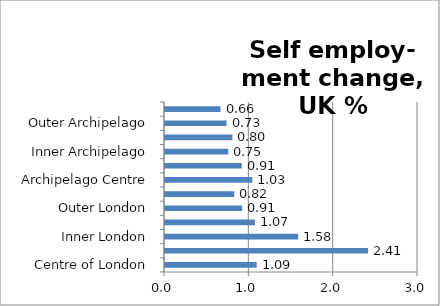
| Category | Series 0 |
|---|---|
| Centre of London | 1.087 |
| London Core | 2.408 |
| Inner London | 1.58 |
| London Suburbs | 1.067 |
| Outer London | 0.915 |
| London Edge | 0.821 |
| Archipelago Centre | 1.034 |
| Archipelago Core | 0.91 |
| Inner Archipelago | 0.75 |
| Archipelago Suburbs | 0.799 |
| Outer Archipelago | 0.73 |
| Archipelago Edge | 0.658 |